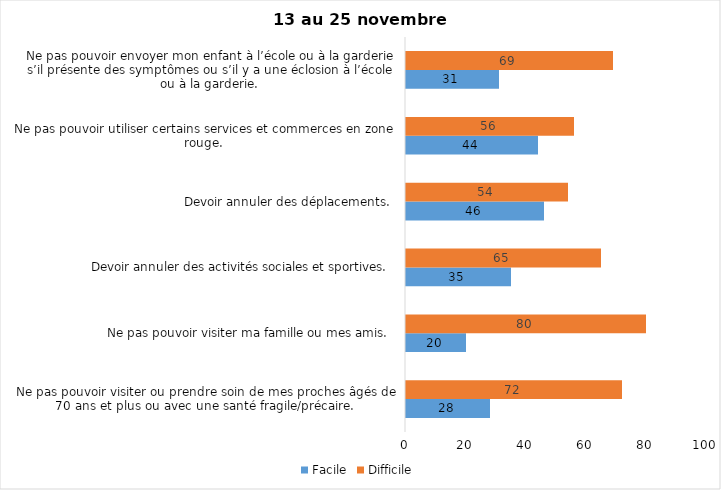
| Category | Facile | Difficile |
|---|---|---|
| Ne pas pouvoir visiter ou prendre soin de mes proches âgés de 70 ans et plus ou avec une santé fragile/précaire.  | 28 | 72 |
| Ne pas pouvoir visiter ma famille ou mes amis.  | 20 | 80 |
| Devoir annuler des activités sociales et sportives.  | 35 | 65 |
| Devoir annuler des déplacements.  | 46 | 54 |
| Ne pas pouvoir utiliser certains services et commerces en zone rouge.  | 44 | 56 |
| Ne pas pouvoir envoyer mon enfant à l’école ou à la garderie s’il présente des symptômes ou s’il y a une éclosion à l’école ou à la garderie.  | 31 | 69 |